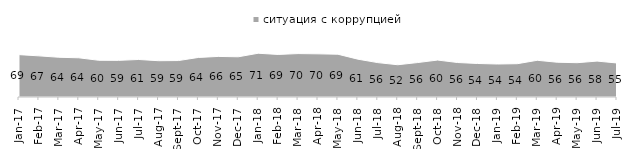
| Category | ситуация с коррупцией |
|---|---|
| 2017-01-01 | 68.7 |
| 2017-02-01 | 66.7 |
| 2017-03-01 | 64.45 |
| 2017-04-01 | 63.55 |
| 2017-05-01 | 59.55 |
| 2017-06-01 | 59.4 |
| 2017-07-01 | 60.85 |
| 2017-08-01 | 58.85 |
| 2017-09-01 | 59.1 |
| 2017-10-01 | 64.15 |
| 2017-11-01 | 65.8 |
| 2017-12-01 | 65.2 |
| 2018-01-01 | 70.95 |
| 2018-02-01 | 69 |
| 2018-03-01 | 70.4 |
| 2018-04-01 | 70 |
| 2018-05-01 | 69.35 |
| 2018-06-01 | 61.35 |
| 2018-07-01 | 55.75 |
| 2018-08-01 | 52.3 |
| 2018-09-01 | 55.85 |
| 2018-10-01 | 59.9 |
| 2018-11-01 | 55.938 |
| 2018-12-01 | 54.35 |
| 2019-01-01 | 53.5 |
| 2019-02-01 | 54 |
| 2019-03-01 | 59.523 |
| 2019-04-01 | 56.386 |
| 2019-05-01 | 55.622 |
| 2019-06-01 | 58.204 |
| 2019-07-01 | 55.149 |